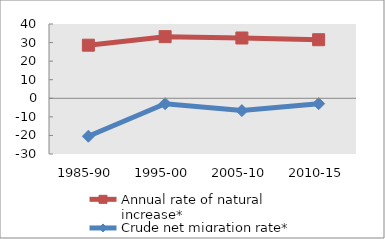
| Category | Annual rate of natural increase* | Crude net migration rate* |
|---|---|---|
| 1985-90 | 28.587 | -20.413 |
| 1995-00 | 33.178 | -2.913 |
| 2005-10 | 32.464 | -6.629 |
| 2010-15 | 31.535 | -2.89 |